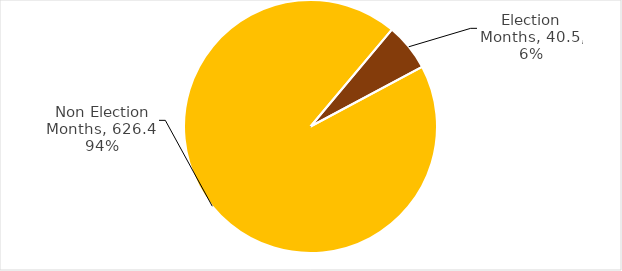
| Category | Total Grants |
|---|---|
| Election Months | 40.537 |
| Non Election Months | 626.402 |